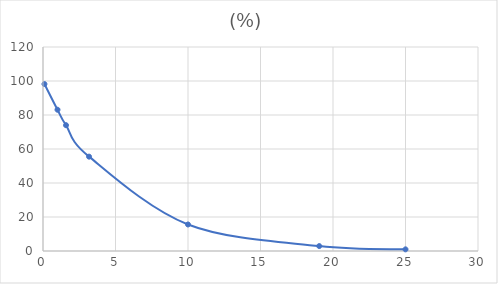
| Category | (%) |
|---|---|
| 0.1 | 98.2 |
| 1.0 | 83.1 |
| 1.588 | 74 |
| 3.175 | 55.5 |
| 10.0 | 15.6 |
| 19.05 | 2.9 |
| 25.0 | 0.97 |